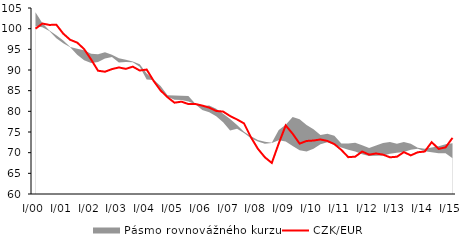
| Category | CZK/EUR  |
|---|---|
| I/00 | 100 |
| II | 101.246 |
| III | 100.903 |
| IV | 100.958 |
| I/01 | 98.789 |
| II | 97.296 |
| III | 96.627 |
| IV | 95.065 |
| I/02 | 92.559 |
| II | 89.823 |
| III | 89.585 |
| IV | 90.216 |
| I/03 | 90.619 |
| II | 90.271 |
| III | 90.812 |
| IV | 89.879 |
| I/04 | 90.107 |
| II | 87.36 |
| III | 85.047 |
| IV | 83.415 |
| I/05 | 82.086 |
| II | 82.344 |
| III | 81.76 |
| IV | 81.779 |
| I/06 | 81.388 |
| II | 80.891 |
| III | 80.101 |
| IV | 79.935 |
| I/07 | 78.864 |
| II | 78.036 |
| III | 77.083 |
| IV | 73.721 |
| I/08 | 70.929 |
| II | 68.886 |
| III | 67.507 |
| IV | 72.241 |
| I/09 | 76.583 |
| II | 74.58 |
| III | 72.188 |
| IV | 72.832 |
| I/10 | 72.935 |
| II | 73.193 |
| III | 72.833 |
| IV | 72.071 |
| I/11 | 70.676 |
| II | 68.913 |
| III | 69.034 |
| IV | 70.277 |
| I/12 | 69.521 |
| II | 69.803 |
| III | 69.519 |
| IV | 68.882 |
| I/13 | 69.015 |
| II | 70.126 |
| III | 69.347 |
| IV | 70.099 |
| I/14 | 70.27 |
| II | 72.543 |
| III | 70.915 |
| IV | 71.279 |
| I/15 | 73.575 |